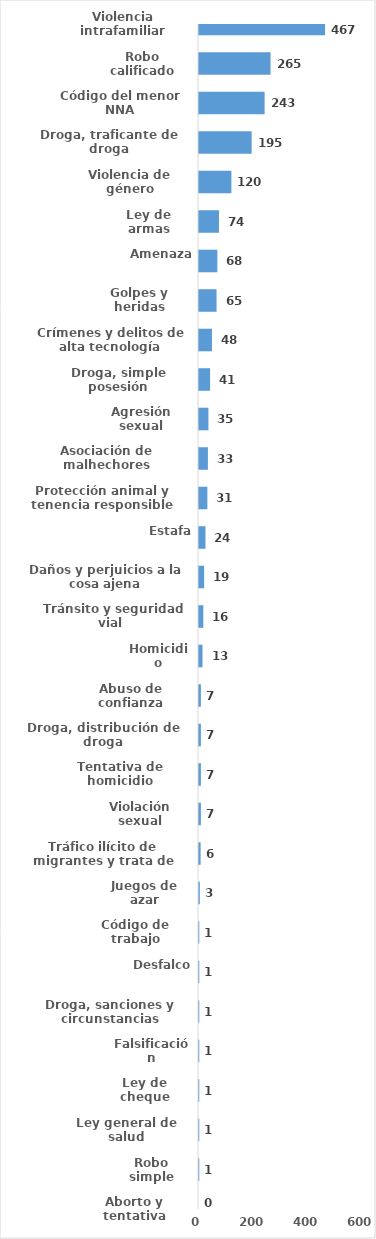
| Category | Series 0 |
|---|---|
| Violencia intrafamiliar | 467 |
| Robo calificado | 265 |
| Código del menor NNA | 243 |
| Droga, traficante de droga | 195 |
| Violencia de género | 120 |
| Ley de armas | 74 |
| Amenaza | 68 |
| Golpes y heridas | 65 |
| Crímenes y delitos de alta tecnología | 48 |
| Droga, simple posesión | 41 |
| Agresión sexual | 35 |
| Asociación de malhechores | 33 |
| Protección animal y tenencia responsible | 31 |
| Estafa | 24 |
| Daños y perjuicios a la cosa ajena | 19 |
| Tránsito y seguridad vial  | 16 |
| Homicidio | 13 |
| Abuso de confianza | 7 |
| Droga, distribución de droga | 7 |
| Tentativa de homicidio | 7 |
| Violación sexual | 7 |
| Tráfico ilícito de migrantes y trata de personas | 6 |
| Juegos de azar | 3 |
| Código de trabajo | 1 |
| Desfalco | 1 |
| Droga, sanciones y circunstancias agravantes | 1 |
| Falsificación | 1 |
| Ley de cheque | 1 |
| Ley general de salud | 1 |
| Robo simple | 1 |
| Aborto y tentativa | 0 |